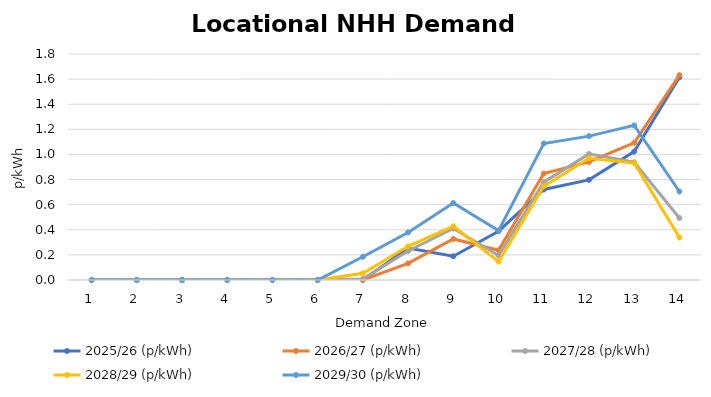
| Category | 2025/26 (p/kWh) | 2026/27 (p/kWh) | 2027/28 (p/kWh) | 2028/29 (p/kWh) | 2029/30 (p/kWh) |
|---|---|---|---|---|---|
| 1.0 | 0 | 0 | 0 | 0 | 0 |
| 2.0 | 0 | 0 | 0 | 0 | 0 |
| 3.0 | 0 | 0 | 0 | 0 | 0 |
| 4.0 | 0 | 0 | 0 | 0 | 0 |
| 5.0 | 0 | 0 | 0 | 0 | 0 |
| 6.0 | 0 | 0 | 0 | 0 | 0 |
| 7.0 | 0 | 0 | 0.009 | 0.054 | 0.185 |
| 8.0 | 0.254 | 0.132 | 0.231 | 0.269 | 0.379 |
| 9.0 | 0.189 | 0.327 | 0.41 | 0.428 | 0.613 |
| 10.0 | 0.389 | 0.237 | 0.195 | 0.147 | 0.394 |
| 11.0 | 0.721 | 0.847 | 0.779 | 0.746 | 1.087 |
| 12.0 | 0.798 | 0.94 | 1.004 | 0.969 | 1.146 |
| 13.0 | 1.023 | 1.093 | 0.938 | 0.931 | 1.232 |
| 14.0 | 1.614 | 1.632 | 0.494 | 0.339 | 0.705 |